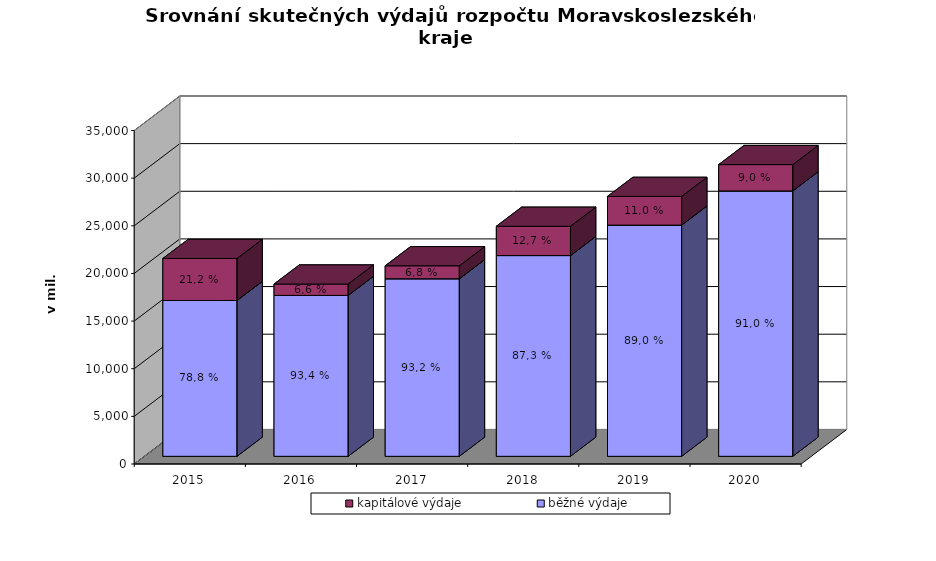
| Category | běžné výdaje | kapitálové výdaje |
|---|---|---|
| 2015.0 | 16356.738 | 4409.991 |
| 2016.0 | 16889.752 | 1192.562 |
| 2017.0 | 18636.111 | 1361.573 |
| 2018.0 | 21071.9 | 3075.103 |
| 2019.0 | 24267.163 | 3013.68 |
| 2020.0 | 27856.287 | 2762.403 |